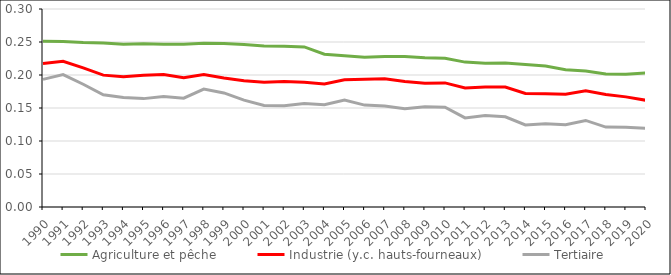
| Category | Agriculture et pêche | Industrie (y.c. hauts-fourneaux) | Tertiaire |
|---|---|---|---|
| 1990.0 | 0.251 | 0.218 | 0.193 |
| 1991.0 | 0.251 | 0.221 | 0.201 |
| 1992.0 | 0.249 | 0.211 | 0.186 |
| 1993.0 | 0.249 | 0.2 | 0.17 |
| 1994.0 | 0.247 | 0.197 | 0.166 |
| 1995.0 | 0.247 | 0.2 | 0.164 |
| 1996.0 | 0.247 | 0.201 | 0.167 |
| 1997.0 | 0.247 | 0.196 | 0.165 |
| 1998.0 | 0.248 | 0.201 | 0.179 |
| 1999.0 | 0.248 | 0.195 | 0.173 |
| 2000.0 | 0.246 | 0.191 | 0.162 |
| 2001.0 | 0.244 | 0.189 | 0.154 |
| 2002.0 | 0.244 | 0.19 | 0.154 |
| 2003.0 | 0.242 | 0.189 | 0.157 |
| 2004.0 | 0.232 | 0.186 | 0.155 |
| 2005.0 | 0.229 | 0.193 | 0.162 |
| 2006.0 | 0.227 | 0.193 | 0.154 |
| 2007.0 | 0.228 | 0.194 | 0.153 |
| 2008.0 | 0.228 | 0.19 | 0.149 |
| 2009.0 | 0.226 | 0.187 | 0.152 |
| 2010.0 | 0.225 | 0.188 | 0.151 |
| 2011.0 | 0.22 | 0.18 | 0.135 |
| 2012.0 | 0.218 | 0.182 | 0.138 |
| 2013.0 | 0.218 | 0.182 | 0.137 |
| 2014.0 | 0.216 | 0.172 | 0.124 |
| 2015.0 | 0.214 | 0.172 | 0.126 |
| 2016.0 | 0.208 | 0.171 | 0.125 |
| 2017.0 | 0.206 | 0.176 | 0.131 |
| 2018.0 | 0.201 | 0.17 | 0.121 |
| 2019.0 | 0.201 | 0.167 | 0.121 |
| 2020.0 | 0.203 | 0.162 | 0.119 |